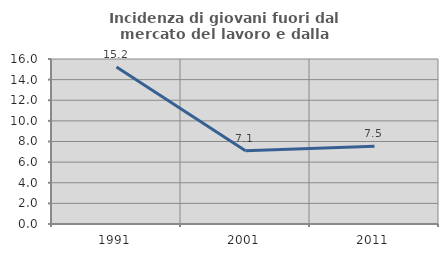
| Category | Incidenza di giovani fuori dal mercato del lavoro e dalla formazione  |
|---|---|
| 1991.0 | 15.217 |
| 2001.0 | 7.092 |
| 2011.0 | 7.534 |